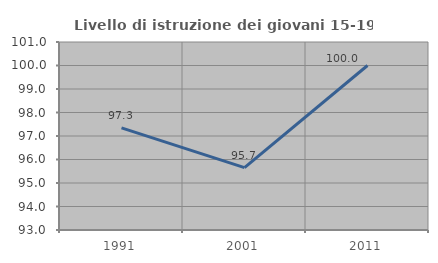
| Category | Livello di istruzione dei giovani 15-19 anni |
|---|---|
| 1991.0 | 97.345 |
| 2001.0 | 95.652 |
| 2011.0 | 100 |